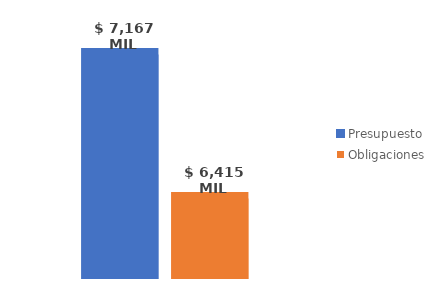
| Category | Presupuesto | Obligaciones |
|---|---|---|
| Total | 7166891341298.506 | 6415256605459.754 |